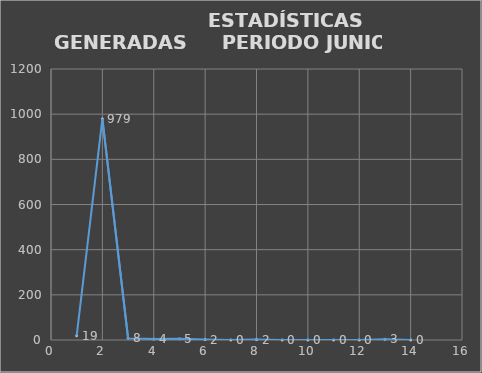
| Category |                   ESTADÍSTICAS GENERADAS     PERIODO JUNIO 19 CANTIDAD |
|---|---|
| 0 | 19 |
| 1 | 979 |
| 2 | 8 |
| 3 | 4 |
| 4 | 5 |
| 5 | 2 |
| 6 | 0 |
| 7 | 2 |
| 8 | 0 |
| 9 | 0 |
| 10 | 0 |
| 11 | 0 |
| 12 | 3 |
| 13 | 0 |